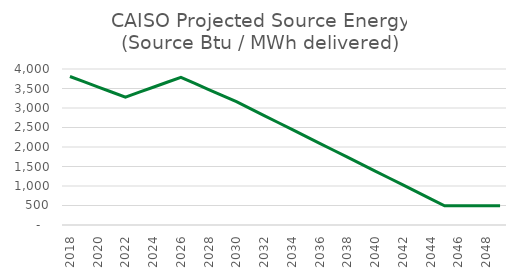
| Category | Btu/kWh |
|---|---|
| 2018.0 | 3807.758 |
| 2019.0 | 3675.462 |
| 2020.0 | 3543.166 |
| 2021.0 | 3410.869 |
| 2022.0 | 3278.573 |
| 2023.0 | 3405.501 |
| 2024.0 | 3532.43 |
| 2025.0 | 3659.358 |
| 2026.0 | 3786.287 |
| 2027.0 | 3630.298 |
| 2028.0 | 3474.31 |
| 2029.0 | 3318.322 |
| 2030.0 | 3162.333 |
| 2031.0 | 2984.416 |
| 2032.0 | 2806.499 |
| 2033.0 | 2628.582 |
| 2034.0 | 2450.664 |
| 2035.0 | 2272.747 |
| 2036.0 | 2094.83 |
| 2037.0 | 1916.913 |
| 2038.0 | 1738.996 |
| 2039.0 | 1561.078 |
| 2040.0 | 1383.161 |
| 2041.0 | 1205.244 |
| 2042.0 | 1027.327 |
| 2043.0 | 849.409 |
| 2044.0 | 671.492 |
| 2045.0 | 493.575 |
| 2046.0 | 493.575 |
| 2047.0 | 493.575 |
| 2048.0 | 493.575 |
| 2049.0 | 493.575 |